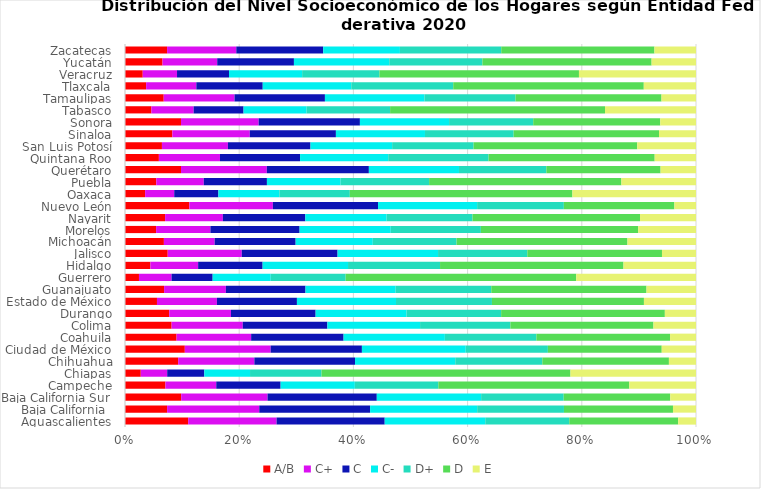
| Category | A/B | C+ | C | C- | D+ | D | E |
|---|---|---|---|---|---|---|---|
| Aguascalientes | 0.111 | 0.155 | 0.189 | 0.176 | 0.147 | 0.191 | 0.031 |
| Baja California  | 0.074 | 0.161 | 0.194 | 0.187 | 0.152 | 0.191 | 0.04 |
| Baja California Sur | 0.098 | 0.151 | 0.191 | 0.183 | 0.145 | 0.187 | 0.045 |
| Campeche | 0.071 | 0.089 | 0.113 | 0.13 | 0.146 | 0.334 | 0.117 |
| Chiapas | 0.028 | 0.046 | 0.065 | 0.08 | 0.125 | 0.436 | 0.22 |
| Chihuahua | 0.093 | 0.133 | 0.176 | 0.176 | 0.152 | 0.222 | 0.047 |
| Ciudad de México | 0.105 | 0.15 | 0.16 | 0.182 | 0.144 | 0.199 | 0.06 |
| Coahuila | 0.09 | 0.131 | 0.162 | 0.177 | 0.16 | 0.234 | 0.045 |
| Colima | 0.082 | 0.125 | 0.148 | 0.162 | 0.158 | 0.251 | 0.075 |
| Durango | 0.077 | 0.108 | 0.148 | 0.159 | 0.166 | 0.287 | 0.055 |
| Estado de México | 0.056 | 0.105 | 0.14 | 0.174 | 0.168 | 0.266 | 0.091 |
| Guanajuato | 0.068 | 0.108 | 0.139 | 0.158 | 0.168 | 0.272 | 0.087 |
| Guerrero | 0.024 | 0.057 | 0.072 | 0.102 | 0.131 | 0.404 | 0.21 |
| Hidalgo | 0.045 | 0.084 | 0.113 | 0.15 | 0.161 | 0.321 | 0.127 |
| Jalisco | 0.075 | 0.13 | 0.168 | 0.176 | 0.156 | 0.236 | 0.06 |
| Michoacán | 0.068 | 0.089 | 0.142 | 0.135 | 0.147 | 0.299 | 0.12 |
| Morelos | 0.054 | 0.095 | 0.156 | 0.16 | 0.158 | 0.276 | 0.101 |
| Nayarit | 0.07 | 0.101 | 0.144 | 0.142 | 0.15 | 0.293 | 0.098 |
| Nuevo León | 0.113 | 0.146 | 0.184 | 0.173 | 0.152 | 0.194 | 0.038 |
| Oaxaca | 0.035 | 0.051 | 0.077 | 0.107 | 0.123 | 0.39 | 0.216 |
| Puebla | 0.055 | 0.083 | 0.111 | 0.129 | 0.155 | 0.337 | 0.131 |
| Querétaro | 0.098 | 0.15 | 0.179 | 0.158 | 0.153 | 0.2 | 0.062 |
| Quintana Roo | 0.059 | 0.107 | 0.14 | 0.154 | 0.176 | 0.291 | 0.072 |
| San Luis Potosí | 0.065 | 0.116 | 0.145 | 0.143 | 0.143 | 0.287 | 0.103 |
| Sinaloa | 0.083 | 0.136 | 0.151 | 0.156 | 0.155 | 0.255 | 0.065 |
| Sonora | 0.098 | 0.136 | 0.177 | 0.156 | 0.147 | 0.223 | 0.063 |
| Tabasco | 0.046 | 0.074 | 0.087 | 0.11 | 0.146 | 0.376 | 0.159 |
| Tamaulipas | 0.068 | 0.124 | 0.158 | 0.174 | 0.159 | 0.256 | 0.06 |
| Tlaxcala | 0.037 | 0.088 | 0.116 | 0.155 | 0.179 | 0.334 | 0.091 |
| Veracruz | 0.031 | 0.06 | 0.091 | 0.128 | 0.135 | 0.349 | 0.205 |
| Yucatán | 0.066 | 0.096 | 0.134 | 0.167 | 0.163 | 0.296 | 0.078 |
| Zacatecas | 0.074 | 0.121 | 0.152 | 0.134 | 0.177 | 0.268 | 0.073 |